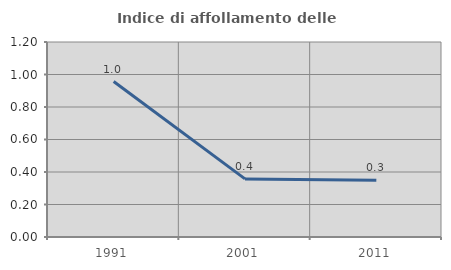
| Category | Indice di affollamento delle abitazioni  |
|---|---|
| 1991.0 | 0.956 |
| 2001.0 | 0.357 |
| 2011.0 | 0.349 |